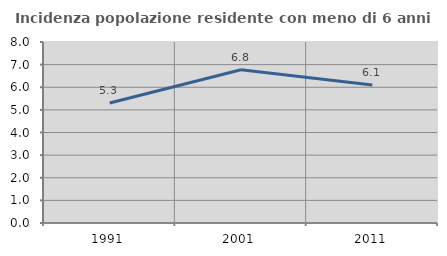
| Category | Incidenza popolazione residente con meno di 6 anni |
|---|---|
| 1991.0 | 5.307 |
| 2001.0 | 6.776 |
| 2011.0 | 6.104 |